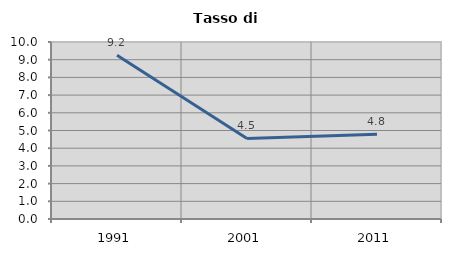
| Category | Tasso di disoccupazione   |
|---|---|
| 1991.0 | 9.247 |
| 2001.0 | 4.55 |
| 2011.0 | 4.79 |